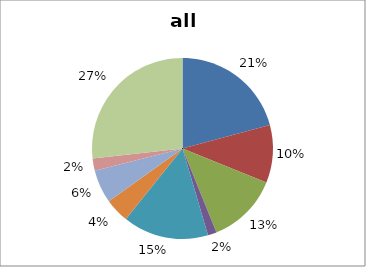
| Category | Series 0 |
|---|---|
| protein metabolism | 238 |
| misc | 118 |
| RNA | 146 |
| DNA | 18 |
| metabolism | 175 |
| signalling | 50 |
| cell division and development | 68 |
| stress | 25 |
| not assigned | 306 |